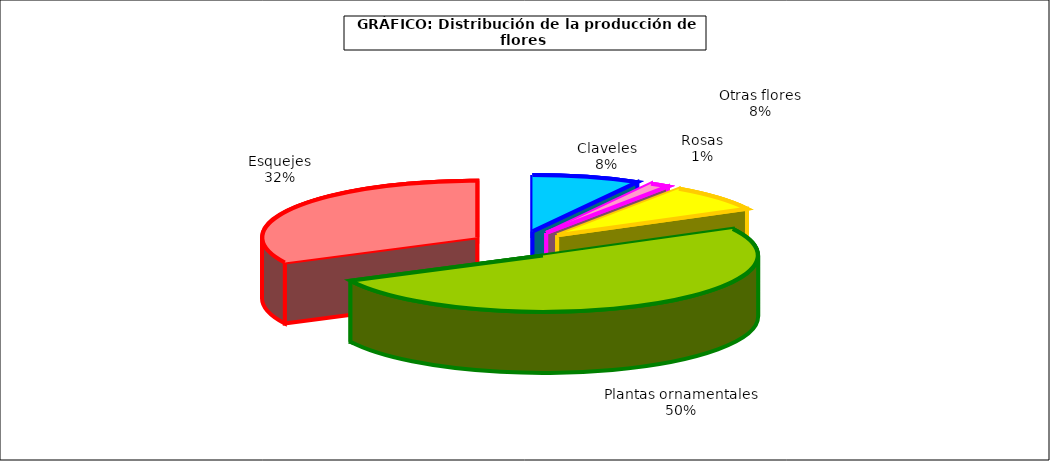
| Category | Series 0 |
|---|---|
| 0 | 52184 |
| 1 | 9513 |
| 2 | 49158 |
| 3 | 325288 |
| 4 | 208950 |